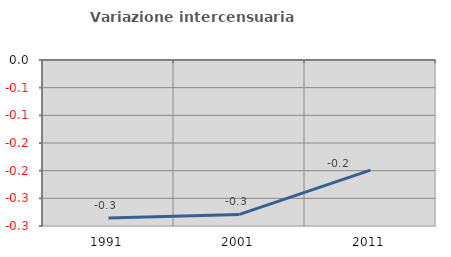
| Category | Variazione intercensuaria annua |
|---|---|
| 1991.0 | -0.286 |
| 2001.0 | -0.279 |
| 2011.0 | -0.199 |